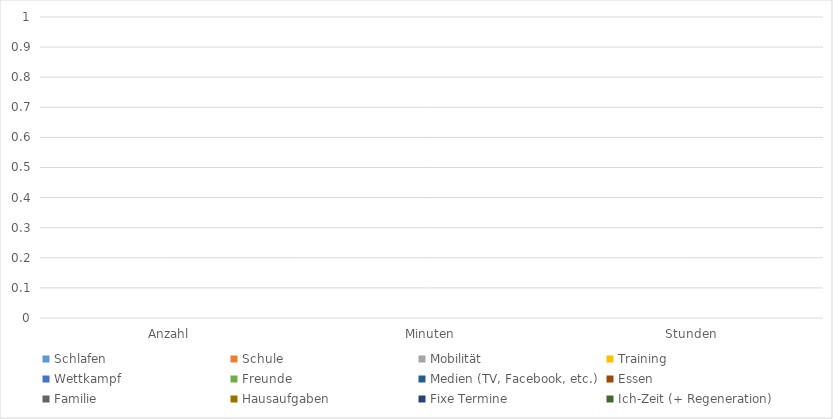
| Category | Schlafen | Schule | Mobilität | Training | Wettkampf | Freunde | Medien (TV, Facebook, etc.) | Essen | Familie | Hausaufgaben | Fixe Termine | Ich-Zeit (+ Regeneration) |
|---|---|---|---|---|---|---|---|---|---|---|---|---|
| Anzahl | 0 | 0 | 0 | 0 | 0 | 0 | 0 | 0 | 0 | 0 | 0 | 0 |
| Minuten | 0 | 0 | 0 | 0 | 0 | 0 | 0 | 0 | 0 | 0 | 0 | 0 |
| Stunden | 0 | 0 | 0 | 0 | 0 | 0 | 0 | 0 | 0 | 0 | 0 | 0 |